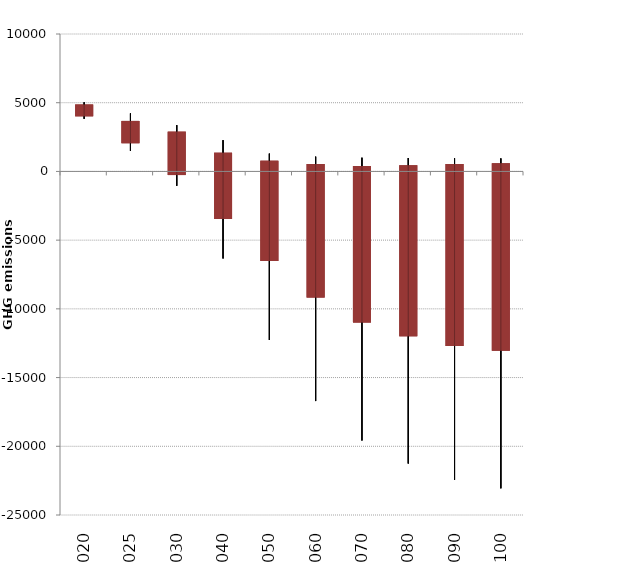
| Category | Perc,20 | Max | Min | Perc.80 |
|---|---|---|---|---|
| 2020.0 | 4012.866 | 5033.205 | 3826.024 | 4867.95 |
| 2025.0 | 2053.558 | 4223.053 | 1487.312 | 3673.616 |
| 2030.0 | -263.214 | 3371.329 | -1048.055 | 2891.613 |
| 2040.0 | -3455.601 | 2275.16 | -6334.512 | 1360.566 |
| 2050.0 | -6511.924 | 1296.389 | -12263.891 | 780.51 |
| 2060.0 | -9174.004 | 1073.937 | -16708.765 | 535.645 |
| 2070.0 | -10995.84 | 997.727 | -19578.85 | 388.01 |
| 2080.0 | -11991.749 | 974.503 | -21255.733 | 445.564 |
| 2090.0 | -12708.283 | 960.64 | -22446.983 | 537.282 |
| 2100.0 | -13052.565 | 948.685 | -23059.848 | 602.1 |